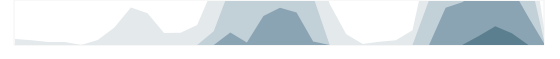
| Category | ИТ | Series 1 | Series 2 | Series 3 |
|---|---|---|---|---|
| 0.333333333333333 | 100 | 0 | 0 | 0 |
| nan | 78 | 0 | 0 | 0 |
| nan | 51 | 0 | 0 | 0 |
| nan | 48 | 0 | 0 | 0 |
| 0.416666666666667 | 2 | 0 | 0 | 0 |
| nan | 84 | 0 | 0 | 0 |
| nan | 292 | 0 | 0 | 0 |
| nan | 625 | 0 | 0 | 0 |
| 0.5 | 531 | 0 | 0 | 0 |
| nan | 198 | 0 | 0 | 0 |
| nan | 203 | 0 | 0 | 0 |
| nan | 332 | 0 | 0 | 0 |
| 0.583333333333333 | 979 | 229 | 0 | 0 |
| nan | 1708 | 958 | 208 | 0 |
| nan | 1543 | 793 | 43 | 0 |
| nan | 1982 | 1232 | 482 | 0 |
| 0.666666666666667 | 2120 | 1370 | 620 | 0 |
| nan | 2040 | 1290 | 540 | 0 |
| nan | 1559 | 809 | 59 | 0 |
| nan | 683 | 0 | 0 | 0 |
| 0.75 | 180 | 0 | 0 | 0 |
| nan | 17 | 0 | 0 | 0 |
| nan | 55 | 0 | 0 | 0 |
| nan | 79 | 0 | 0 | 0 |
| 0.833333333333333 | 246 | 0 | 0 | 0 |
| nan | 1499 | 749 | 0 | 0 |
| nan | 2122 | 1372 | 622 | 0 |
| nan | 2211 | 1461 | 711 | 0 |
| 0.916666666666667 | 2400 | 1650 | 900 | 150 |
| nan | 2561 | 1811 | 1061 | 311 |
| nan | 2447 | 1697 | 947 | 197 |
| nan | 1963 | 1213 | 463 | 0 |
| 0.9993055555555556 | 170 | 0 | 0 | 0 |